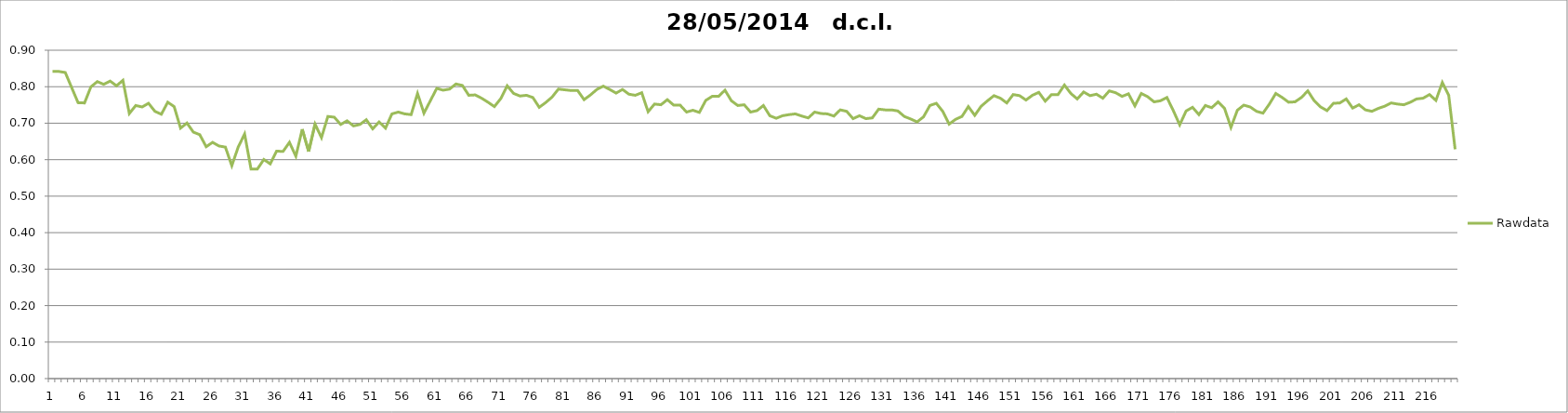
| Category | Rawdata |
|---|---|
| 0 | 0.842 |
| 1 | 0.842 |
| 2 | 0.839 |
| 3 | 0.798 |
| 4 | 0.756 |
| 5 | 0.756 |
| 6 | 0.8 |
| 7 | 0.814 |
| 8 | 0.807 |
| 9 | 0.816 |
| 10 | 0.803 |
| 11 | 0.818 |
| 12 | 0.726 |
| 13 | 0.748 |
| 14 | 0.744 |
| 15 | 0.755 |
| 16 | 0.732 |
| 17 | 0.724 |
| 18 | 0.758 |
| 19 | 0.746 |
| 20 | 0.686 |
| 21 | 0.7 |
| 22 | 0.676 |
| 23 | 0.668 |
| 24 | 0.636 |
| 25 | 0.648 |
| 26 | 0.638 |
| 27 | 0.635 |
| 28 | 0.584 |
| 29 | 0.635 |
| 30 | 0.67 |
| 31 | 0.574 |
| 32 | 0.574 |
| 33 | 0.6 |
| 34 | 0.588 |
| 35 | 0.624 |
| 36 | 0.622 |
| 37 | 0.648 |
| 38 | 0.61 |
| 39 | 0.684 |
| 40 | 0.622 |
| 41 | 0.698 |
| 42 | 0.661 |
| 43 | 0.718 |
| 44 | 0.716 |
| 45 | 0.696 |
| 46 | 0.706 |
| 47 | 0.692 |
| 48 | 0.696 |
| 49 | 0.71 |
| 50 | 0.684 |
| 51 | 0.704 |
| 52 | 0.686 |
| 53 | 0.726 |
| 54 | 0.73 |
| 55 | 0.726 |
| 56 | 0.724 |
| 57 | 0.782 |
| 58 | 0.728 |
| 59 | 0.762 |
| 60 | 0.796 |
| 61 | 0.79 |
| 62 | 0.794 |
| 63 | 0.808 |
| 64 | 0.804 |
| 65 | 0.777 |
| 66 | 0.778 |
| 67 | 0.769 |
| 68 | 0.758 |
| 69 | 0.746 |
| 70 | 0.768 |
| 71 | 0.802 |
| 72 | 0.782 |
| 73 | 0.775 |
| 74 | 0.777 |
| 75 | 0.771 |
| 76 | 0.744 |
| 77 | 0.757 |
| 78 | 0.772 |
| 79 | 0.794 |
| 80 | 0.792 |
| 81 | 0.79 |
| 82 | 0.79 |
| 83 | 0.765 |
| 84 | 0.778 |
| 85 | 0.792 |
| 86 | 0.802 |
| 87 | 0.792 |
| 88 | 0.783 |
| 89 | 0.792 |
| 90 | 0.78 |
| 91 | 0.777 |
| 92 | 0.784 |
| 93 | 0.732 |
| 94 | 0.753 |
| 95 | 0.75 |
| 96 | 0.765 |
| 97 | 0.75 |
| 98 | 0.75 |
| 99 | 0.73 |
| 100 | 0.736 |
| 101 | 0.73 |
| 102 | 0.763 |
| 103 | 0.774 |
| 104 | 0.774 |
| 105 | 0.79 |
| 106 | 0.762 |
| 107 | 0.748 |
| 108 | 0.75 |
| 109 | 0.73 |
| 110 | 0.734 |
| 111 | 0.748 |
| 112 | 0.72 |
| 113 | 0.714 |
| 114 | 0.72 |
| 115 | 0.724 |
| 116 | 0.726 |
| 117 | 0.72 |
| 118 | 0.714 |
| 119 | 0.73 |
| 120 | 0.726 |
| 121 | 0.726 |
| 122 | 0.72 |
| 123 | 0.736 |
| 124 | 0.732 |
| 125 | 0.712 |
| 126 | 0.72 |
| 127 | 0.712 |
| 128 | 0.714 |
| 129 | 0.738 |
| 130 | 0.736 |
| 131 | 0.736 |
| 132 | 0.734 |
| 133 | 0.718 |
| 134 | 0.712 |
| 135 | 0.704 |
| 136 | 0.718 |
| 137 | 0.748 |
| 138 | 0.755 |
| 139 | 0.732 |
| 140 | 0.698 |
| 141 | 0.71 |
| 142 | 0.718 |
| 143 | 0.746 |
| 144 | 0.722 |
| 145 | 0.746 |
| 146 | 0.762 |
| 147 | 0.776 |
| 148 | 0.769 |
| 149 | 0.756 |
| 150 | 0.779 |
| 151 | 0.776 |
| 152 | 0.764 |
| 153 | 0.777 |
| 154 | 0.785 |
| 155 | 0.761 |
| 156 | 0.779 |
| 157 | 0.779 |
| 158 | 0.804 |
| 159 | 0.782 |
| 160 | 0.767 |
| 161 | 0.786 |
| 162 | 0.776 |
| 163 | 0.78 |
| 164 | 0.769 |
| 165 | 0.789 |
| 166 | 0.784 |
| 167 | 0.774 |
| 168 | 0.781 |
| 169 | 0.748 |
| 170 | 0.782 |
| 171 | 0.773 |
| 172 | 0.759 |
| 173 | 0.762 |
| 174 | 0.771 |
| 175 | 0.734 |
| 176 | 0.696 |
| 177 | 0.734 |
| 178 | 0.744 |
| 179 | 0.724 |
| 180 | 0.748 |
| 181 | 0.742 |
| 182 | 0.759 |
| 183 | 0.74 |
| 184 | 0.688 |
| 185 | 0.736 |
| 186 | 0.75 |
| 187 | 0.744 |
| 188 | 0.732 |
| 189 | 0.728 |
| 190 | 0.753 |
| 191 | 0.782 |
| 192 | 0.771 |
| 193 | 0.758 |
| 194 | 0.759 |
| 195 | 0.771 |
| 196 | 0.789 |
| 197 | 0.762 |
| 198 | 0.744 |
| 199 | 0.734 |
| 200 | 0.755 |
| 201 | 0.756 |
| 202 | 0.767 |
| 203 | 0.742 |
| 204 | 0.75 |
| 205 | 0.736 |
| 206 | 0.732 |
| 207 | 0.74 |
| 208 | 0.746 |
| 209 | 0.756 |
| 210 | 0.753 |
| 211 | 0.75 |
| 212 | 0.758 |
| 213 | 0.767 |
| 214 | 0.769 |
| 215 | 0.779 |
| 216 | 0.763 |
| 217 | 0.812 |
| 218 | 0.777 |
| 219 | 0.629 |